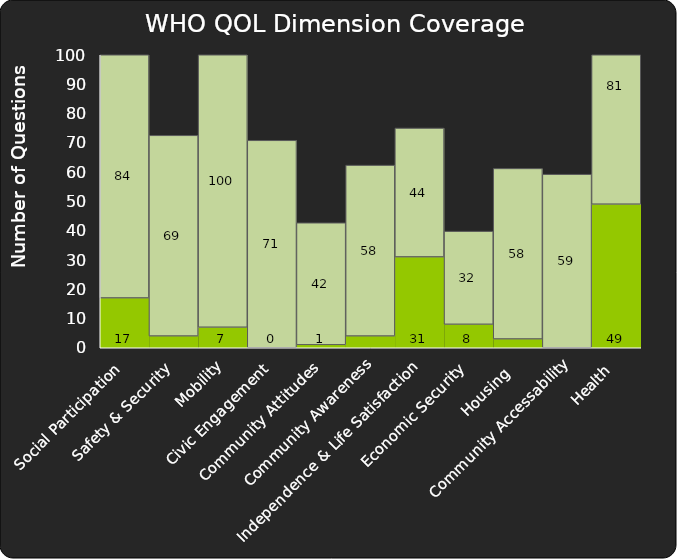
| Category | Series 0 | Series 1 |
|---|---|---|
|  Social Participation | 17 | 83.7 |
| Safety & Security | 4 | 68.5 |
| Mobility | 7 | 100 |
| Civic Engagement | 0 | 70.8 |
| Community Attitudes | 1 | 41.667 |
| Community Awareness | 4 | 58.333 |
| Independence & Life Satisfaction | 31 | 44 |
| Economic Security | 8 | 31.8 |
| Housing  | 3 | 58.209 |
| Community Accessability | 0 | 59.236 |
| Health | 49 | 81 |